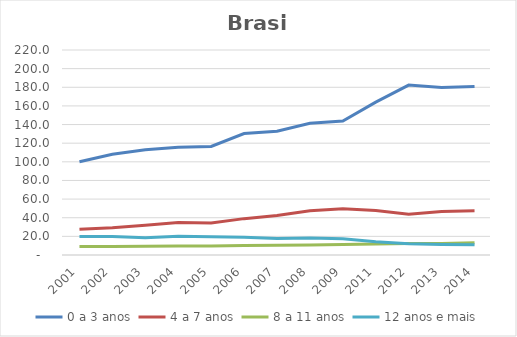
| Category | 0 a 3 anos | 4 a 7 anos | 8 a 11 anos | 12 anos e mais |
|---|---|---|---|---|
| 2001.0 | 100.161 | 27.693 | 9.003 | 19.753 |
| 2002.0 | 108.185 | 29.24 | 9.134 | 19.87 |
| 2003.0 | 112.924 | 31.905 | 9.425 | 18.487 |
| 2004.0 | 115.508 | 34.975 | 9.581 | 19.988 |
| 2005.0 | 116.479 | 34.27 | 9.66 | 19.461 |
| 2006.0 | 130.343 | 39.03 | 10.249 | 19.014 |
| 2007.0 | 132.764 | 42.312 | 10.448 | 17.642 |
| 2008.0 | 141.372 | 47.595 | 10.659 | 18.132 |
| 2009.0 | 143.723 | 49.658 | 11.259 | 17.307 |
| 2011.0 | 164.082 | 47.719 | 11.908 | 14.178 |
| 2012.0 | 182.31 | 43.617 | 12.323 | 12.06 |
| 2013.0 | 179.886 | 46.713 | 12.274 | 11.324 |
| 2014.0 | 180.901 | 47.535 | 13.109 | 11.133 |